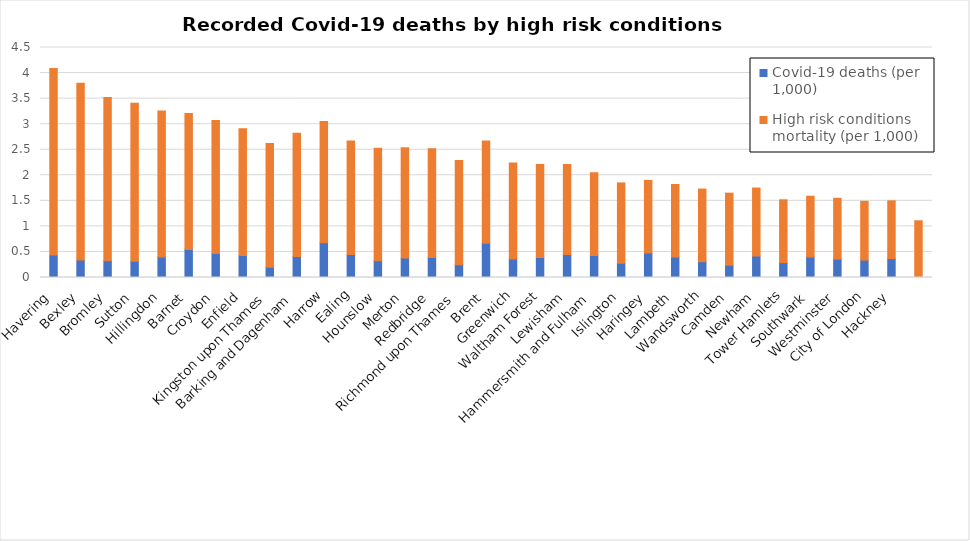
| Category | Covid-19 deaths (per 1,000) | High risk conditions mortality (per 1,000) |
|---|---|---|
| Havering | 0.44 | 3.65 |
| Bexley | 0.34 | 3.46 |
| Bromley | 0.33 | 3.19 |
| Sutton | 0.32 | 3.09 |
| Hillingdon | 0.4 | 2.86 |
| Barnet | 0.55 | 2.66 |
| Croydon | 0.47 | 2.6 |
| Enfield | 0.43 | 2.48 |
| Kingston upon Thames | 0.2 | 2.42 |
| Barking and Dagenham | 0.41 | 2.41 |
| Harrow | 0.68 | 2.37 |
| Ealing | 0.45 | 2.22 |
| Hounslow | 0.33 | 2.2 |
| Merton | 0.38 | 2.16 |
| Redbridge | 0.39 | 2.13 |
| Richmond upon Thames | 0.25 | 2.04 |
| Brent | 0.67 | 2 |
| Greenwich | 0.36 | 1.88 |
| Waltham Forest | 0.39 | 1.82 |
| Lewisham | 0.45 | 1.76 |
| Hammersmith and Fulham | 0.43 | 1.62 |
| Islington | 0.28 | 1.57 |
| Haringey | 0.48 | 1.42 |
| Lambeth | 0.4 | 1.42 |
| Wandsworth | 0.31 | 1.42 |
| Camden | 0.24 | 1.41 |
| Newham | 0.42 | 1.33 |
| Tower Hamlets | 0.29 | 1.23 |
| Southwark | 0.4 | 1.19 |
| Westminster | 0.36 | 1.19 |
| City of London | 0.34 | 1.15 |
| Hackney | 0.37 | 1.13 |